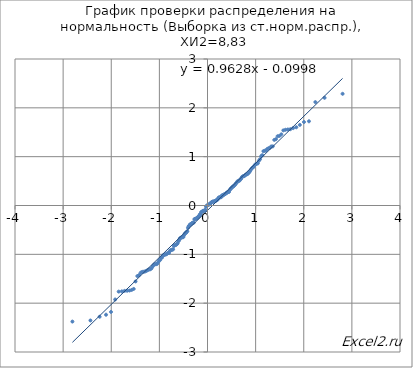
| Category | Сортированная выборка |
|---|---|
| -2.8070337683438042 | -2.377 |
| -2.4323790585844463 | -2.354 |
| -2.2414027276049446 | -2.278 |
| -2.1083583991691093 | -2.237 |
| -2.004654461765096 | -2.179 |
| -1.9188762262165762 | -1.925 |
| -1.8452581167555007 | -1.764 |
| -1.7804643416920256 | -1.759 |
| -1.722383890252691 | -1.748 |
| -1.6695925772881866 | -1.745 |
| -1.621082250852408 | -1.741 |
| -1.5761119739866583 | -1.729 |
| -1.5341205443525459 | -1.709 |
| -1.49467224980662 | -1.555 |
| -1.4574217385976507 | -1.445 |
| -1.4220904321223211 | -1.425 |
| -1.388450197319148 | -1.376 |
| -1.3563117453352478 | -1.359 |
| -1.3255161998000577 | -1.358 |
| -1.2959288462604264 | -1.349 |
| -1.2674344169169052 | -1.338 |
| -1.2399334778907378 | -1.32 |
| -1.2133396224885178 | -1.31 |
| -1.1875772631885786 | -1.305 |
| -1.162579874843623 | -1.286 |
| -1.1382885824147984 | -1.246 |
| -1.1146510149326594 | -1.214 |
| -1.091620367434168 | -1.203 |
| -1.0691546270064722 | -1.202 |
| -1.0472159295232348 | -1.196 |
| -1.0257700213555492 | -1.165 |
| -1.0047858060707031 | -1.125 |
| -0.9842349604463254 | -1.116 |
| -0.9640916074069338 | -1.07 |
| -0.9443320360069184 | -1.066 |
| -0.9249344605317266 | -1.025 |
| -0.9058788123092854 | -1.014 |
| -0.8871465590188761 | -1.007 |
| -0.8687205472312288 | -1.001 |
| -0.8505848646683847 | -0.997 |
| -0.8327247192774433 | -0.976 |
| -0.8151263327011551 | -0.971 |
| -0.7977768461252382 | -0.97 |
| -0.7806642368062336 | -0.927 |
| -0.7637772438495227 | -0.914 |
| -0.7471053020262449 | -0.911 |
| -0.730638482599372 | -0.901 |
| -0.7143674402801874 | -0.898 |
| -0.6982833655625876 | -0.828 |
| -0.6823779417884336 | -0.816 |
| -0.6666433063863062 | -0.81 |
| -0.6510720158013259 | -0.803 |
| -0.6356570136975828 | -0.79 |
| -0.6203916020690775 | -0.774 |
| -0.6052694149415095 | -0.731 |
| -0.5902843943869687 | -0.713 |
| -0.5754307686077732 | -0.675 |
| -0.5607030318750833 | -0.666 |
| -0.5460959261333559 | -0.656 |
| -0.5316044241037058 | -0.652 |
| -0.5172237137383637 | -0.647 |
| -0.502949183895058 | -0.647 |
| -0.4887764111146694 | -0.612 |
| -0.47470114739821306 | -0.584 |
| -0.46071930889032536 | -0.563 |
| -0.446826965386226 | -0.561 |
| -0.4330203305877187 | -0.539 |
| -0.41929575304139605 | -0.528 |
| -0.4056497076989145 | -0.457 |
| -0.39207878804514956 | -0.428 |
| -0.37857969874529823 | -0.413 |
| -0.3651492487666822 | -0.391 |
| -0.35178434493515626 | -0.386 |
| -0.3384819858897398 | -0.383 |
| -0.3252392564023954 | -0.364 |
| -0.31205332203283226 | -0.355 |
| -0.2989214240908573 | -0.352 |
| -0.28584087488116566 | -0.35 |
| -0.2728090532075823 | -0.281 |
| -0.2598234001156768 | -0.275 |
| -0.2468814148543784 | -0.271 |
| -0.23398065103876436 | -0.268 |
| -0.22111871299757052 | -0.264 |
| -0.20829325229022513 | -0.249 |
| -0.1955019643793194 | -0.23 |
| -0.18274258544544394 | -0.224 |
| -0.1700128893322194 | -0.208 |
| -0.1573106846101707 | -0.181 |
| -0.14463381174882106 | -0.18 |
| -0.13198014038704126 | -0.138 |
| -0.11934756669227513 | -0.131 |
| -0.10673401079978624 | -0.123 |
| -0.09413741432353637 | -0.111 |
| -0.08155573793071842 | -0.11 |
| -0.06898695897232807 | -0.107 |
| -0.05642906916247406 | -0.097 |
| -0.04388007229940119 | -0.091 |
| -0.031337982021426625 | -0.024 |
| -0.018800819591187675 | -0.011 |
| -0.006266611701750475 | 0 |
| 0.006266611701750335 | 0.012 |
| 0.018800819591187536 | 0.019 |
| 0.03133798202142648 | 0.019 |
| 0.043880072299401045 | 0.027 |
| 0.05642906916247392 | 0.039 |
| 0.06898695897232791 | 0.052 |
| 0.08155573793071842 | 0.063 |
| 0.09413741432353637 | 0.074 |
| 0.10673401079978624 | 0.078 |
| 0.11934756669227513 | 0.08 |
| 0.13198014038704126 | 0.08 |
| 0.14463381174882106 | 0.086 |
| 0.1573106846101707 | 0.089 |
| 0.1700128893322194 | 0.101 |
| 0.18274258544544394 | 0.102 |
| 0.1955019643793194 | 0.117 |
| 0.20829325229022513 | 0.118 |
| 0.22111871299757052 | 0.144 |
| 0.23398065103876436 | 0.162 |
| 0.24688141485437856 | 0.165 |
| 0.25982340011567695 | 0.168 |
| 0.27280905320758253 | 0.171 |
| 0.2858408748811657 | 0.172 |
| 0.2989214240908574 | 0.205 |
| 0.31205332203283237 | 0.206 |
| 0.3252392564023952 | 0.21 |
| 0.33848198588973966 | 0.223 |
| 0.35178434493515615 | 0.227 |
| 0.36514924876668203 | 0.238 |
| 0.37857969874529807 | 0.246 |
| 0.3920787880451495 | 0.253 |
| 0.4056497076989145 | 0.269 |
| 0.41929575304139605 | 0.272 |
| 0.4330203305877187 | 0.278 |
| 0.446826965386226 | 0.278 |
| 0.46071930889032536 | 0.317 |
| 0.47470114739821306 | 0.335 |
| 0.4887764111146694 | 0.354 |
| 0.502949183895058 | 0.362 |
| 0.5172237137383637 | 0.383 |
| 0.5316044241037058 | 0.388 |
| 0.5460959261333559 | 0.398 |
| 0.5607030318750833 | 0.419 |
| 0.5754307686077732 | 0.426 |
| 0.5902843943869687 | 0.453 |
| 0.6052694149415094 | 0.466 |
| 0.6203916020690777 | 0.492 |
| 0.6356570136975827 | 0.499 |
| 0.6510720158013267 | 0.505 |
| 0.6666433063863068 | 0.512 |
| 0.6823779417884333 | 0.538 |
| 0.6982833655625873 | 0.547 |
| 0.7143674402801878 | 0.581 |
| 0.730638482599372 | 0.595 |
| 0.7471053020262449 | 0.601 |
| 0.7637772438495227 | 0.603 |
| 0.7806642368062336 | 0.618 |
| 0.7977768461252382 | 0.632 |
| 0.8151263327011551 | 0.639 |
| 0.8327247192774433 | 0.644 |
| 0.8505848646683847 | 0.669 |
| 0.8687205472312288 | 0.68 |
| 0.8871465590188761 | 0.71 |
| 0.9058788123092854 | 0.741 |
| 0.9249344605317266 | 0.765 |
| 0.9443320360069184 | 0.782 |
| 0.9640916074069338 | 0.797 |
| 0.9842349604463254 | 0.83 |
| 1.0047858060707031 | 0.85 |
| 1.0257700213555492 | 0.857 |
| 1.0472159295232348 | 0.864 |
| 1.0691546270064722 | 0.92 |
| 1.0916203674341685 | 0.946 |
| 1.1146510149326603 | 1.008 |
| 1.1382885824147984 | 1.031 |
| 1.1625798748436227 | 1.112 |
| 1.1875772631885781 | 1.12 |
| 1.213339622488518 | 1.126 |
| 1.2399334778907378 | 1.155 |
| 1.2674344169169047 | 1.172 |
| 1.2959288462604264 | 1.181 |
| 1.3255161998000577 | 1.21 |
| 1.3563117453352478 | 1.211 |
| 1.388450197319148 | 1.343 |
| 1.4220904321223211 | 1.359 |
| 1.4574217385976511 | 1.419 |
| 1.49467224980662 | 1.424 |
| 1.5341205443525465 | 1.457 |
| 1.5761119739866585 | 1.538 |
| 1.621082250852408 | 1.551 |
| 1.6695925772881872 | 1.556 |
| 1.7223838902526907 | 1.563 |
| 1.7804643416920258 | 1.585 |
| 1.8452581167555016 | 1.602 |
| 1.9188762262165762 | 1.651 |
| 2.0046544617650963 | 1.709 |
| 2.1083583991691093 | 1.724 |
| 2.2414027276049464 | 2.118 |
| 2.432379058584449 | 2.205 |
| 2.8070337683438114 | 2.287 |